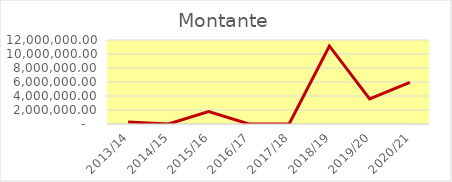
| Category | Montante |
|---|---|
| 2013/14 | 299400 |
| 2014/15 | 0 |
| 2015/16 | 1769395.15 |
| 2016/17 | 0 |
| 2017/18 | 0 |
| 2018/19 | 11149902.35 |
| 2019/20 | 3596284.01 |
| 2020/21 | 5949914.5 |